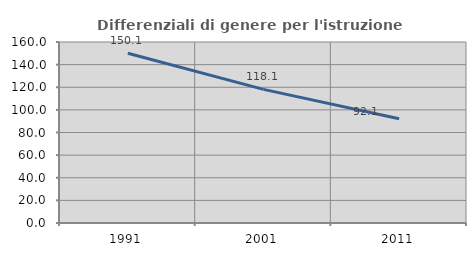
| Category | Differenziali di genere per l'istruzione superiore |
|---|---|
| 1991.0 | 150.076 |
| 2001.0 | 118.099 |
| 2011.0 | 92.133 |